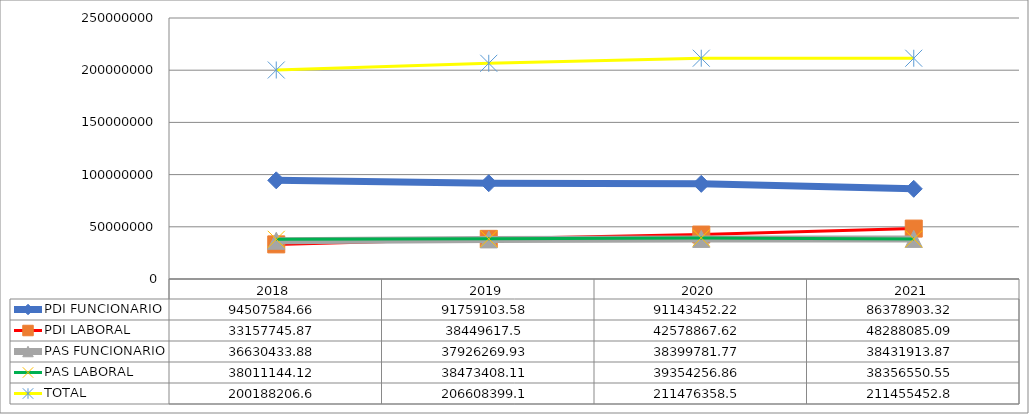
| Category | PDI FUNCIONARIO | PDI LABORAL | PAS FUNCIONARIO | PAS LABORAL | TOTAL |
|---|---|---|---|---|---|
| 2018 | 94507584.656 | 33157745.868 | 36630433.88 | 38011144.115 | 200188206.65 |
| 2019 | 91759103.578 | 38449617.503 | 37926269.931 | 38473408.109 | 206608399.12 |
| 2020 | 91143452.217 | 42578867.621 | 38399781.765 | 39354256.856 | 211476358.46 |
| 2021 | 86378903.315 | 48288085.087 | 38431913.868 | 38356550.55 | 211455452.82 |